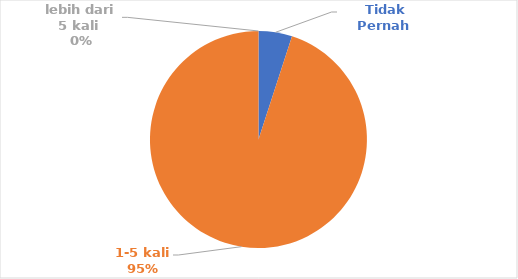
| Category | 1. Penyuluhan perikanan |
|---|---|
| Tidak Pernah  | 2 |
| 1-5 kali  | 38 |
| lebih dari 5 kali  | 0 |